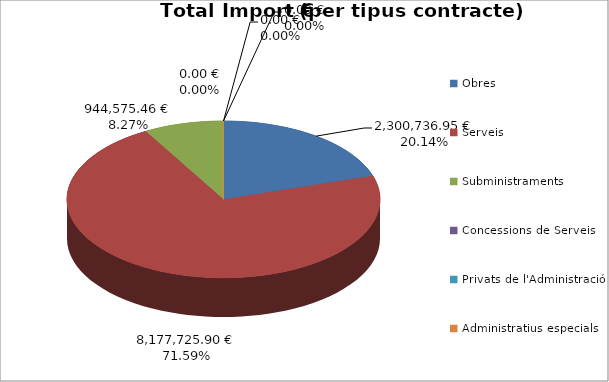
| Category | Total preu              (amb iva) |
|---|---|
| Obres | 2300736.95 |
| Serveis | 8177725.9 |
| Subministraments | 944575.46 |
| Concessions de Serveis | 0 |
| Privats de l'Administració | 0 |
| Administratius especials | 0 |